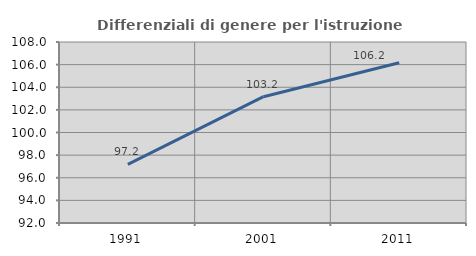
| Category | Differenziali di genere per l'istruzione superiore |
|---|---|
| 1991.0 | 97.186 |
| 2001.0 | 103.166 |
| 2011.0 | 106.163 |